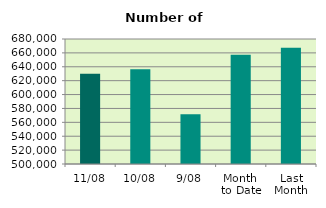
| Category | Series 0 |
|---|---|
| 11/08 | 630116 |
| 10/08 | 636492 |
| 9/08 | 571748 |
| Month 
to Date | 657217.25 |
| Last
Month | 667427.091 |